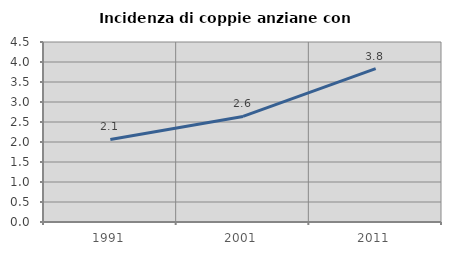
| Category | Incidenza di coppie anziane con figli |
|---|---|
| 1991.0 | 2.065 |
| 2001.0 | 2.639 |
| 2011.0 | 3.836 |